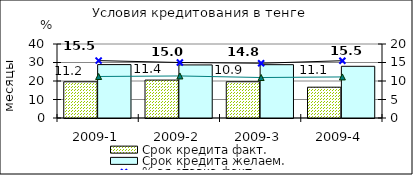
| Category | Срок кредита факт.  | Срок кредита желаем. |
|---|---|---|
| 2009-1 | 19.57 | 28.86 |
| 2009-2 | 20.49 | 28.69 |
| 2009-3 | 19.59 | 28.82 |
| 2009-4 | 16.65 | 27.94 |